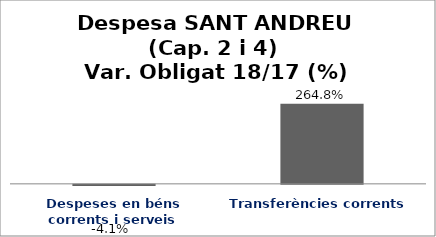
| Category | Series 0 |
|---|---|
| Despeses en béns corrents i serveis | -0.041 |
| Transferències corrents | 2.648 |